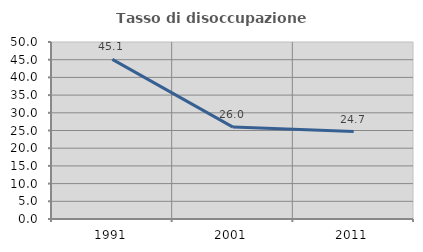
| Category | Tasso di disoccupazione giovanile  |
|---|---|
| 1991.0 | 45.103 |
| 2001.0 | 25.967 |
| 2011.0 | 24.691 |